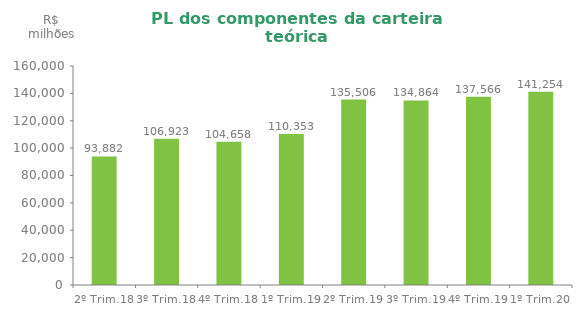
| Category | Series 0 |
|---|---|
| 2º Trim.18 | 93882.016 |
| 3º Trim.18 | 106923.21 |
| 4º Trim.18 | 104658.138 |
| 1º Trim.19 | 110353.048 |
| 2º Trim.19 | 135505.78 |
| 3º Trim.19 | 134863.51 |
| 4º Trim.19 | 137565.795 |
| 1º Trim.20 | 141254.49 |